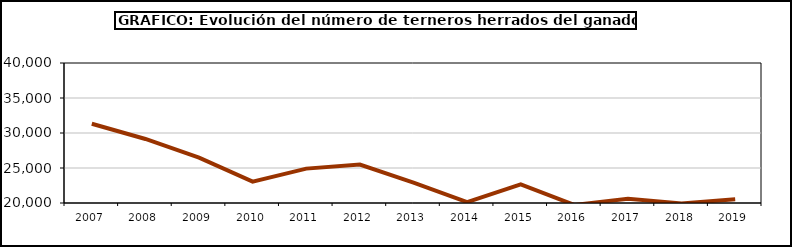
| Category | Ganado de Lidia |
|---|---|
| 2007.0 | 31320 |
| 2008.0 | 29147 |
| 2009.0 | 26477 |
| 2010.0 | 23052 |
| 2011.0 | 24912 |
| 2012.0 | 25485 |
| 2013.0 | 22909 |
| 2014.0 | 20127 |
| 2015.0 | 22647 |
| 2016.0 | 19726 |
| 2017.0 | 20623 |
| 2018.0 | 19942 |
| 2019.0 | 20534 |